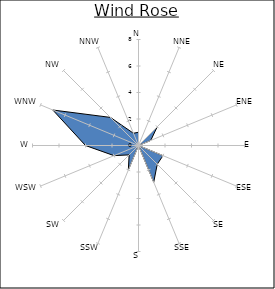
| Category | Series 0 |
|---|---|
| N | 1 |
| NNE | 0 |
| NE | 2 |
| ENE | 1 |
| E | 0 |
| ESE | 2 |
| SE | 2 |
| SSE | 3 |
| S | 0 |
| SSW | 2 |
| SW | 1 |
| WSW | 2 |
| W | 4 |
| WNW | 7 |
| NW | 3 |
| NNW | 1 |